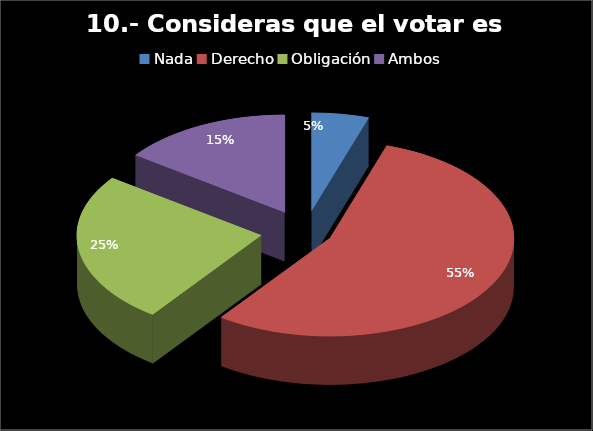
| Category | Series 0 |
|---|---|
| Nada | 4 |
| Derecho | 44 |
| Obligación | 20 |
| Ambos | 12 |